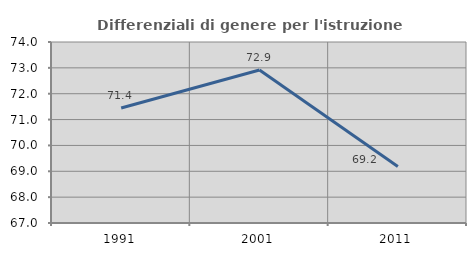
| Category | Differenziali di genere per l'istruzione superiore |
|---|---|
| 1991.0 | 71.447 |
| 2001.0 | 72.917 |
| 2011.0 | 69.185 |